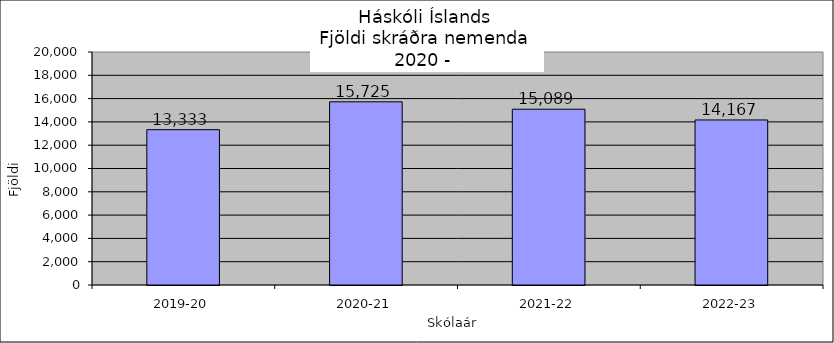
| Category | Series 0 |
|---|---|
| 2019-20 | 13333 |
| 2020-21 | 15725 |
| 2021-22 | 15089 |
| 2022-23 | 14167 |